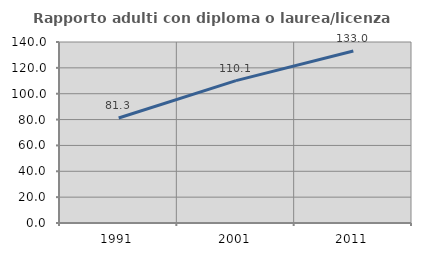
| Category | Rapporto adulti con diploma o laurea/licenza media  |
|---|---|
| 1991.0 | 81.25 |
| 2001.0 | 110.127 |
| 2011.0 | 132.979 |